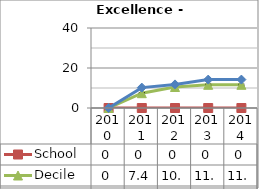
| Category | School  | Decile | National |
|---|---|---|---|
| 2010.0 | 0 | 0 | 0 |
| 2011.0 | 0 | 7.4 | 10.2 |
| 2012.0 | 0 | 10.5 | 11.8 |
| 2013.0 | 0 | 11.6 | 14.2 |
| 2014.0 | 0 | 11.6 | 14.2 |